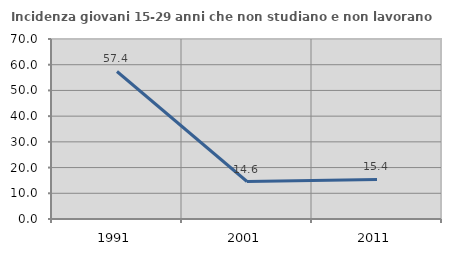
| Category | Incidenza giovani 15-29 anni che non studiano e non lavorano  |
|---|---|
| 1991.0 | 57.368 |
| 2001.0 | 14.576 |
| 2011.0 | 15.396 |